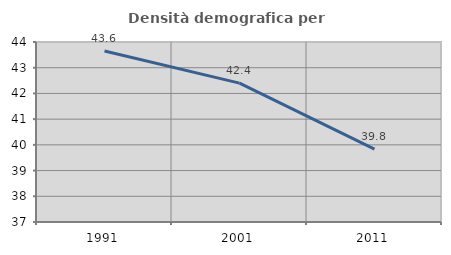
| Category | Densità demografica |
|---|---|
| 1991.0 | 43.65 |
| 2001.0 | 42.401 |
| 2011.0 | 39.831 |